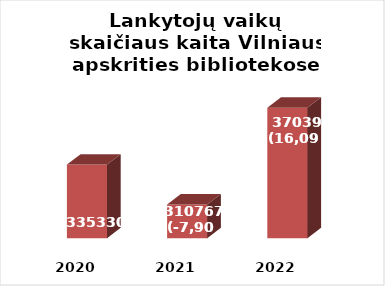
| Category | Series 0 |
|---|---|
| 2020.0 | 335330 |
| 2021.0 | 310767 |
| 2022.0 | 370396 |